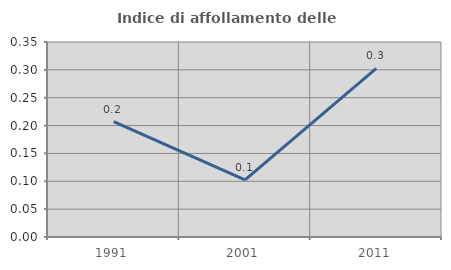
| Category | Indice di affollamento delle abitazioni  |
|---|---|
| 1991.0 | 0.207 |
| 2001.0 | 0.103 |
| 2011.0 | 0.303 |